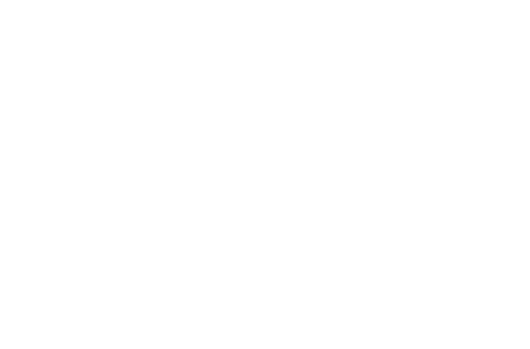
| Category | Atmaksātā pamatsumma | Atmaksātie procenti |
|---|---|---|
| 2019 | 316.351 | 226.28 |
| 2020 | 1105.769 | 739.178 |
| 2021 | 1939.715 | 1207.547 |
| 2022 | 2820.703 | 1628.874 |
| 2023 | 3751.386 | 2000.507 |
| 2024 | 4734.566 | 2319.642 |
| 2025 | 5773.206 | 2583.318 |
| 2026 | 6870.433 | 2788.406 |
| 2027 | 8029.552 | 2931.602 |
| 2028 | 9254.054 | 3009.415 |
| 2029 | 10000 | 3023.153 |